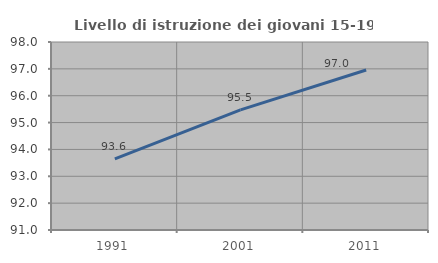
| Category | Livello di istruzione dei giovani 15-19 anni |
|---|---|
| 1991.0 | 93.645 |
| 2001.0 | 95.473 |
| 2011.0 | 96.957 |